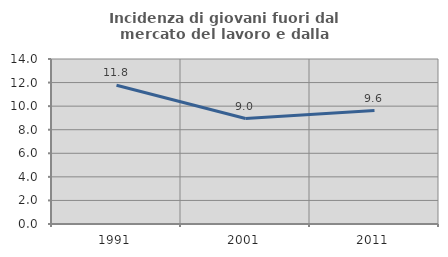
| Category | Incidenza di giovani fuori dal mercato del lavoro e dalla formazione  |
|---|---|
| 1991.0 | 11.772 |
| 2001.0 | 8.951 |
| 2011.0 | 9.626 |